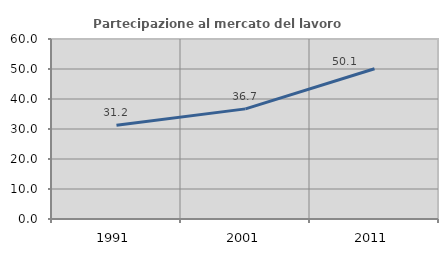
| Category | Partecipazione al mercato del lavoro  femminile |
|---|---|
| 1991.0 | 31.236 |
| 2001.0 | 36.711 |
| 2011.0 | 50.079 |